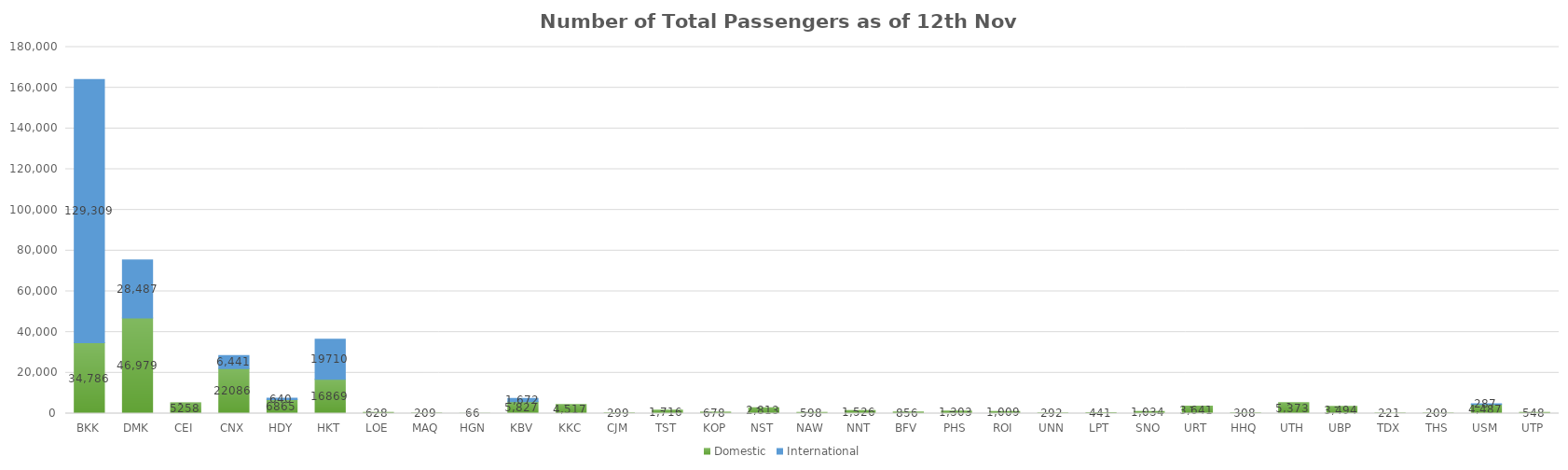
| Category | Domestic | International |
|---|---|---|
| BKK | 34786 | 129309 |
| DMK | 46979 | 28487 |
| CEI | 5258 | 0 |
| CNX | 22086 | 6441 |
| HDY | 6865 | 640 |
| HKT | 16869 | 19710 |
| LOE | 628 | 0 |
| MAQ | 209 | 0 |
| HGN | 66 | 0 |
| KBV | 5827 | 1672 |
| KKC | 4517 | 0 |
| CJM | 299 | 0 |
| TST | 1716 | 0 |
| KOP | 678 | 0 |
| NST | 2813 | 0 |
| NAW | 598 | 0 |
| NNT | 1526 | 0 |
| BFV | 856 | 0 |
| PHS | 1303 | 0 |
| ROI | 1009 | 0 |
| UNN | 292 | 0 |
| LPT | 441 | 0 |
| SNO | 1034 | 0 |
| URT | 3641 | 0 |
| HHQ | 308 | 0 |
| UTH | 5373 | 0 |
| UBP | 3494 | 0 |
| TDX | 221 | 0 |
| THS | 209 | 0 |
| USM | 4487 | 287 |
| UTP | 548 | 0 |